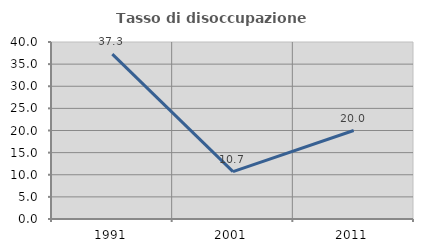
| Category | Tasso di disoccupazione giovanile  |
|---|---|
| 1991.0 | 37.255 |
| 2001.0 | 10.714 |
| 2011.0 | 20 |